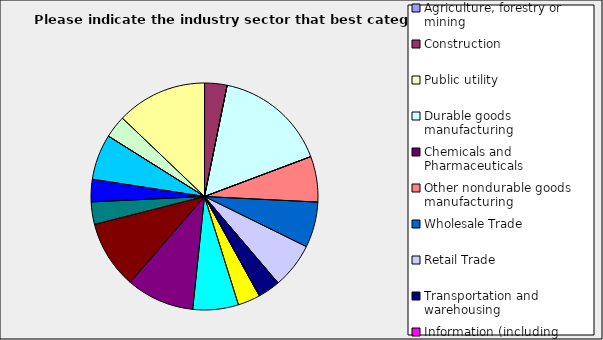
| Category | Series 0 |
|---|---|
| Agriculture, forestry or mining | 0 |
| Construction | 0.032 |
| Public utility | 0 |
| Durable goods manufacturing | 0.161 |
| Chemicals and Pharmaceuticals | 0 |
| Other nondurable goods manufacturing | 0.065 |
| Wholesale Trade | 0.065 |
| Retail Trade | 0.065 |
| Transportation and warehousing | 0.032 |
| Information (including broadcasting and telecommunication) | 0 |
| Finance and Insurance | 0.032 |
| Real Estate | 0.065 |
| Professional, scientific and technical services | 0.097 |
| Consulting | 0.097 |
| Administrative and office services (including waste management) | 0.032 |
| Education | 0.032 |
| Health Care and social services | 0.065 |
| Arts, entertainment and recreation | 0 |
| Accommodation and food services | 0.032 |
| Other | 0.129 |